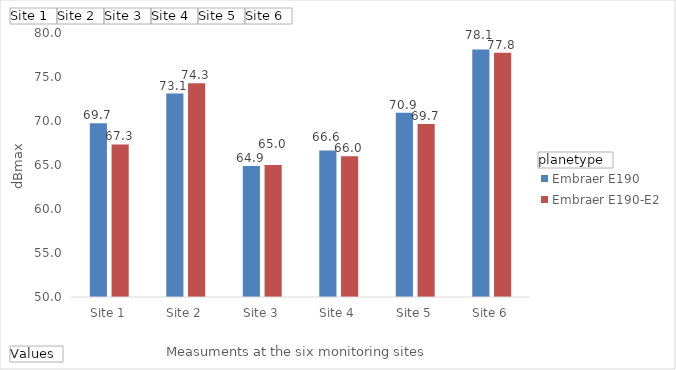
| Category | Embraer E190 | Embraer E190-E2 |
|---|---|---|
| Site 1 | 69.745 | 67.333 |
| Site 2 | 73.125 | 74.286 |
| Site 3 | 64.875 | 65 |
| Site 4 | 66.647 | 66 |
| Site 5 | 70.939 | 69.667 |
| Site 6 | 78.128 | 77.75 |